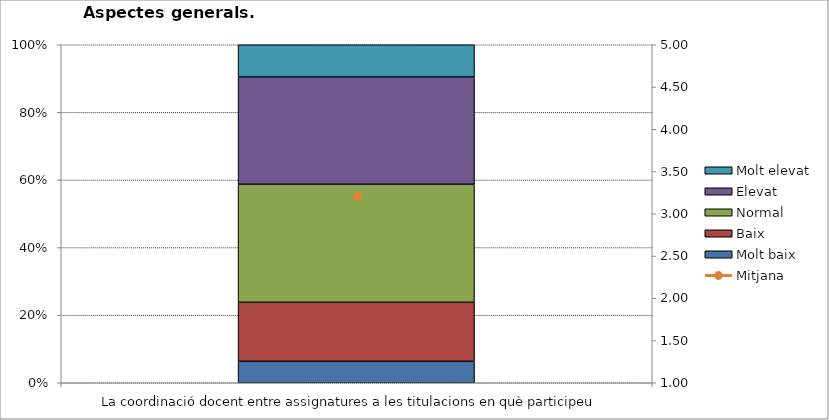
| Category | Molt baix | Baix | Normal  | Elevat | Molt elevat |
|---|---|---|---|---|---|
| La coordinació docent entre assignatures a les titulacions en què participeu | 4 | 11 | 22 | 20 | 6 |